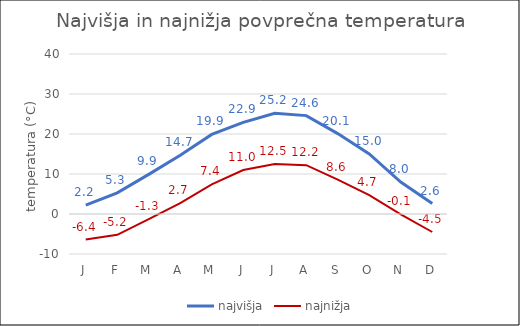
| Category | najvišja | najnižja |
|---|---|---|
| J | 2.2 | -6.4 |
| F | 5.3 | -5.2 |
| M | 9.9 | -1.3 |
| A | 14.7 | 2.7 |
| M | 19.9 | 7.4 |
| J | 22.9 | 11 |
| J | 25.2 | 12.5 |
| A | 24.6 | 12.2 |
| S | 20.1 | 8.6 |
| O | 15 | 4.7 |
| N | 8 | -0.1 |
| D | 2.6 | -4.5 |